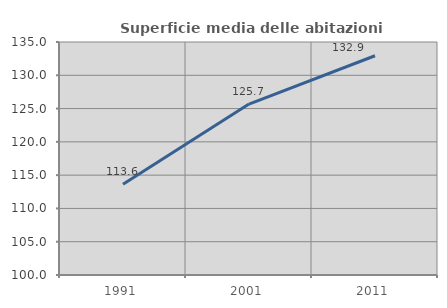
| Category | Superficie media delle abitazioni occupate |
|---|---|
| 1991.0 | 113.62 |
| 2001.0 | 125.677 |
| 2011.0 | 132.938 |